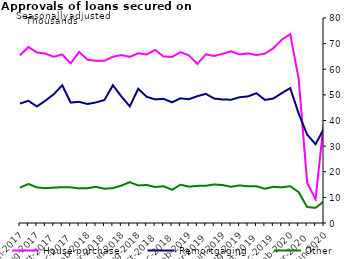
| Category | House purchase | Remortgaging | Other |
|---|---|---|---|
| Jun-2017 | 65448 | 46613 | 13816 |
| Jul-2017 | 68688 | 47694 | 15225 |
| Aug-2017 | 66549 | 45465 | 13886 |
| Sep-2017 | 66080 | 47705 | 13588 |
| Oct-2017 | 64868 | 50251 | 13813 |
| Nov-2017 | 65774 | 53763 | 13969 |
| Dec-2017 | 62292 | 46991 | 13920 |
| Jan-2018 | 66752 | 47287 | 13500 |
| Feb-2018 | 63720 | 46441 | 13585 |
| Mar-2018 | 63316 | 47047 | 14109 |
| Apr-2018 | 63303 | 48005 | 13378 |
| May-2018 | 64895 | 53757 | 13590 |
| Jun-2018 | 65527 | 49408 | 14599 |
| Jul-2018 | 64827 | 45510 | 15928 |
| Aug-2018 | 66232 | 52388 | 14648 |
| Sep-2018 | 65738 | 49258 | 14830 |
| Oct-2018 | 67527 | 48235 | 14049 |
| Nov-2018 | 64998 | 48458 | 14340 |
| Dec-2018 | 64814 | 47079 | 12971 |
| Jan-2019 | 66679 | 48652 | 14938 |
| Feb-2019 | 65433 | 48298 | 14176 |
| Mar-2019 | 62063 | 49491 | 14484 |
| Apr-2019 | 65799 | 50394 | 14535 |
| May-2019 | 65181 | 48572 | 15037 |
| Jun-2019 | 66023 | 48184 | 14806 |
| Jul-2019 | 66995 | 48124 | 14131 |
| Aug-2019 | 65780 | 49073 | 14682 |
| Sep-2019 | 66190 | 49412 | 14323 |
| Oct-2019 | 65552 | 50645 | 14354 |
| Nov-2019 | 66096 | 48047 | 13357 |
| Dec-2019 | 68164 | 48570 | 14121 |
| Jan-2020 | 71557 | 50679 | 13923 |
| Feb-2020 | 73660 | 52643 | 14368 |
| Mar-2020 | 56340 | 42680 | 12028 |
| Apr-2020 | 15856 | 34534 | 6240 |
| May-2020 | 9273 | 30728 | 5912 |
| Jun-2020 | 40010 | 36926 | 8506 |